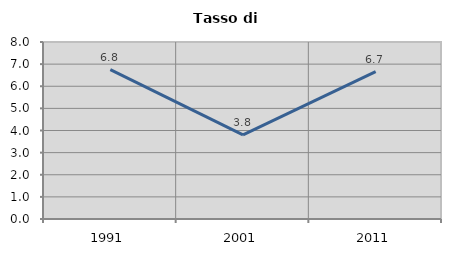
| Category | Tasso di disoccupazione   |
|---|---|
| 1991.0 | 6.753 |
| 2001.0 | 3.806 |
| 2011.0 | 6.656 |